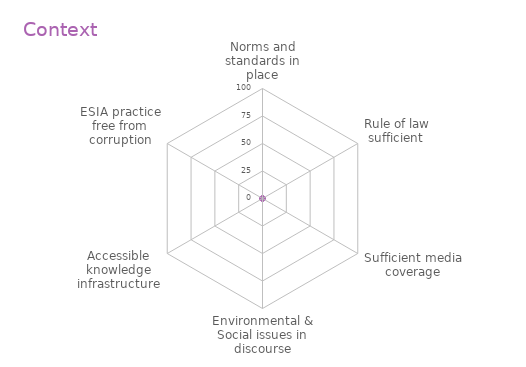
| Category | Series 0 |
|---|---|
| Norms and standards in place | 0 |
| Rule of law sufficient  | 0 |
| Sufficient media coverage | 0 |
| Environmental & Social issues in discourse | 0 |
| Accessible knowledge infrastructure | 0 |
| ESIA practice free from corruption | 0 |